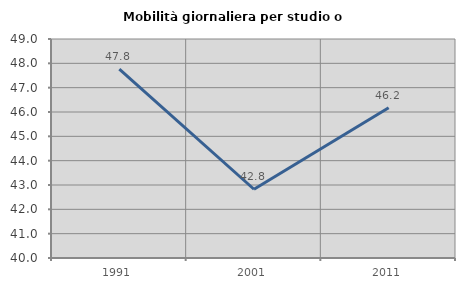
| Category | Mobilità giornaliera per studio o lavoro |
|---|---|
| 1991.0 | 47.765 |
| 2001.0 | 42.825 |
| 2011.0 | 46.172 |